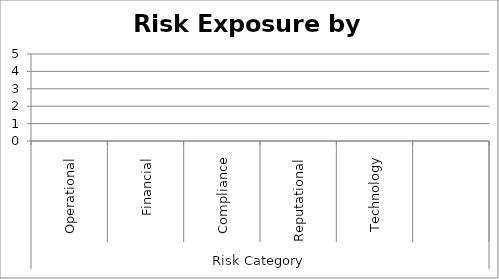
| Category | Risk Exposure by Category |
|---|---|
| 0 | 0 |
| 1 | 0 |
| 2 | 0 |
| 3 | 0 |
| 4 | 0 |
| 5 | 0 |